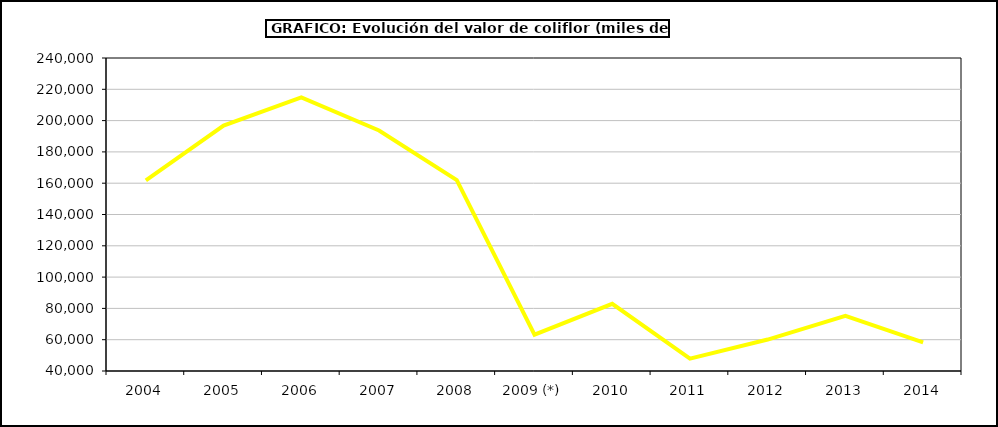
| Category | Valor |
|---|---|
| 2004 | 161766.018 |
| 2005 | 196866.08 |
| 2006 | 214820 |
| 2007 | 193667.735 |
| 2008 | 161966.625 |
| 2009 (*) | 63214.224 |
| 2010 | 82925.588 |
| 2011 | 47916.69 |
| 2012 | 60097.372 |
| 2013 | 75196.05 |
| 2014 | 58249.149 |